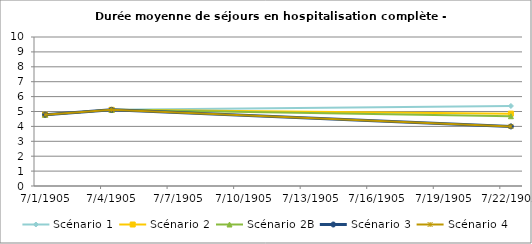
| Category | Scénario 1 | Scénario 2 | Scénario 2B | Scénario 3 | Scénario 4 |
|---|---|---|---|---|---|
| 2009.0 | 4.785 | 4.785 | 4.785 | 4.785 | 4.785 |
| 2012.0 | 5.112 | 5.112 | 5.112 | 5.112 | 5.112 |
| 2030.0 | 5.371 | 4.857 | 4.682 | 4 | 4 |